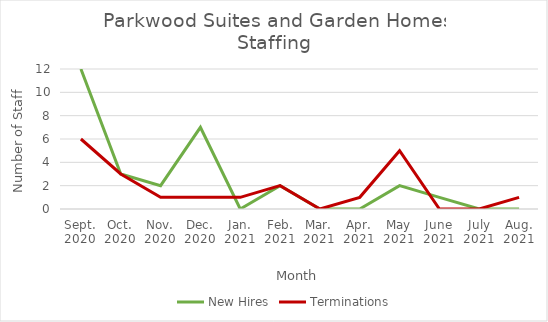
| Category | New Hires | Terminations |
|---|---|---|
| Sept.
2020 | 12 | 6 |
| Oct.
2020 | 3 | 3 |
| Nov.
2020 | 2 | 1 |
| Dec.
2020 | 7 | 1 |
| Jan.
2021 | 0 | 1 |
| Feb.
2021 | 2 | 2 |
| Mar.
2021 | 0 | 0 |
| Apr.
2021 | 0 | 1 |
| May
2021 | 2 | 5 |
| June
2021 | 1 | 0 |
| July
2021 | 0 | 0 |
| Aug.
2021 | 0 | 1 |